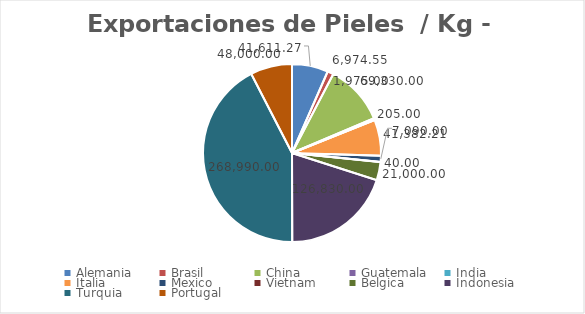
| Category | kg | Valor US  |
|---|---|---|
| Alemania | 41611.271 | 319873.696 |
| Brasil | 6974.55 | 105356.406 |
| China | 69330 | 19910.961 |
| Guatemala | 1975 | 30159.811 |
| India | 205 | 3813.24 |
| Italia | 41382.21 | 444529.188 |
| Mexico | 7090 | 122666.57 |
| Vietnam | 40 | 200 |
| Belgica | 21000 | 11550 |
| Indonesia | 126830 | 63415 |
| Turquia | 268990 | 34545.8 |
| Portugal | 48000 | 36000 |